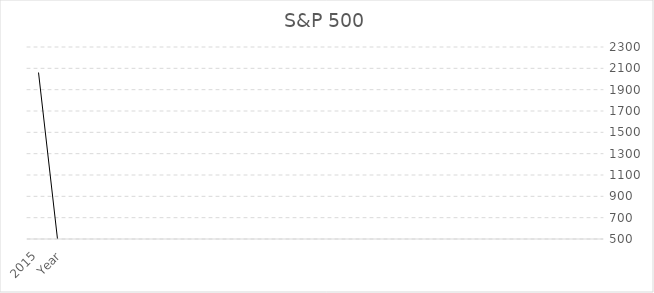
| Category | Series 0 | Series 1 | Series 2 |
|---|---|---|---|
| 0 | 2106.2 | 2080.76 | 2104.05 |
| 1 | 2094.32 | 1893.7 | 2079.36 |
| 2 | 2020.86 | 1871.91 | 1920.03 |
| 3 | 2112.66 | 1867.01 | 1972.18 |
| 4 | 2132.82 | 2044.02 | 2103.84 |
| 5 | 2129.87 | 2056.32 | 2063.11 |
| 6 | 2134.72 | 2067.93 | 2107.39 |
| 7 | 2125.92 | 2048.38 | 2085.51 |
| 8 | 2117.52 | 2039.69 | 2067.89 |
| 9 | 2119.59 | 1980.9 | 2104.5 |
| 10 | 2072.36 | 1988.12 | 1994.99 |
| 11 | 2093.55 | 1972.56 | 2058.9 |
| 12 | 2075.76 | 2001.01 | 2067.56 |
| 13 | 2018.19 | 1820.66 | 2018.05 |
| 14 | 2019.26 | 1964.04 | 1972.29 |
| 15 | 2005.04 | 1904.78 | 2003.37 |
| 16 | 1991.39 | 1930.67 | 1930.67 |
| 17 | 1968.17 | 1915.98 | 1960.23 |
| 18 | 1924.03 | 1859.79 | 1923.57 |
| 19 | 1897.28 | 1814.36 | 1883.95 |
| 20 | 1883.97 | 1834.44 | 1872.34 |
| 21 | 1867.92 | 1737.92 | 1859.45 |
| 22 | 1850.84 | 1770.45 | 1782.59 |
| 23 | 1849.44 | 1767.99 | 1848.36 |
| 24 | 1813.55 | 1746.2 | 1805.81 |
| 25 | 1775.22 | 1646.47 | 1756.54 |
| 26 | 1729.86 | 1633.41 | 1681.55 |
| 27 | 1709.67 | 1627.47 | 1632.97 |
| 28 | 1698.78 | 1604.57 | 1685.73 |
| 29 | 1654.19 | 1560.33 | 1606.28 |
| 30 | 1687.18 | 1581.28 | 1630.74 |
| 31 | 1597.57 | 1536.03 | 1597.57 |
| 32 | 1570.28 | 1501.48 | 1569.19 |
| 33 | 1530.94 | 1485.01 | 1514.68 |
| 34 | 1509.94 | 1426.19 | 1498.11 |
| 35 | 1448 | 1398.11 | 1426.19 |
| 36 | 1434.27 | 1343.35 | 1416.18 |
| 37 | 1470.96 | 1403.28 | 1412.16 |
| 38 | 1474.51 | 1396.56 | 1440.67 |
| 39 | 1426.68 | 1354.65 | 1406.58 |
| 40 | 1391.74 | 1325.41 | 1379.32 |
| 41 | 1363.46 | 1266.74 | 1362.16 |
| 42 | 1415.32 | 1291.98 | 1310.33 |
| 43 | 1422.38 | 1357.38 | 1397.91 |
| 44 | 1419.15 | 1340.03 | 1408.47 |
| 45 | 1378.04 | 1312.45 | 1365.68 |
| 46 | 1333.47 | 1258.86 | 1312.41 |
| 47 | 1269.37 | 1202.37 | 1257.6 |
| 48 | 1277.55 | 1158.66 | 1246.96 |
| 49 | 1292.66 | 1074.77 | 1253.3 |
| 50 | 1229.29 | 1114.22 | 1131.42 |
| 51 | 1307.38 | 1101.54 | 1218.89 |
| 52 | 1356.48 | 1282.86 | 1292.28 |
| 53 | 1345.2 | 1258.07 | 1320.64 |
| 54 | 1370.58 | 1311.8 | 1345.2 |
| 55 | 1364.56 | 1294.7 | 1363.61 |
| 56 | 1332.28 | 1249.05 | 1325.83 |
| 57 | 1344.07 | 1289.14 | 1327.22 |
| 58 | 1302.67 | 1257.62 | 1286.12 |
| 59 | 1262.6 | 1186.6 | 1257.64 |
| 60 | 1227.08 | 1173 | 1180.55 |
| 61 | 1196.14 | 1131.87 | 1183.26 |
| 62 | 1157.16 | 1049.72 | 1141.2 |
| 63 | 1129.24 | 1039.7 | 1049.33 |
| 64 | 1120.95 | 1010.91 | 1101.6 |
| 65 | 1131.23 | 1028.33 | 1030.71 |
| 66 | 1205.13 | 1040.78 | 1089.41 |
| 67 | 1219.8 | 1170.69 | 1186.69 |
| 68 | 1180.69 | 1105.36 | 1169.43 |
| 69 | 1112.42 | 1044.5 | 1104.49 |
| 70 | 1150.45 | 1071.59 | 1073.87 |
| 71 | 1130.38 | 1085.89 | 1115.1 |
| 72 | 1113.69 | 1029.38 | 1095.63 |
| 73 | 1101.36 | 1019.95 | 1036.19 |
| 74 | 1080.15 | 991.97 | 1057.08 |
| 75 | 1039.47 | 978.51 | 1020.62 |
| 76 | 996.68 | 869.32 | 987.48 |
| 77 | 956.23 | 888.86 | 919.32 |
| 78 | 930.17 | 866.1 | 919.14 |
| 79 | 888.7 | 783.32 | 872.81 |
| 80 | 832.98 | 666.79 | 797.87 |
| 81 | 875.01 | 734.52 | 735.09 |
| 82 | 943.85 | 804.3 | 825.88 |
| 83 | 918.85 | 815.69 | 903.25 |
| 84 | 1007.51 | 741.02 | 896.24 |
| 85 | 1167.03 | 839.8 | 968.75 |
| 86 | 1303.04 | 1106.42 | 1166.36 |
| 87 | 1313.15 | 1247.45 | 1282.83 |
| 88 | 1292.17 | 1200.44 | 1267.38 |
| 89 | 1404.05 | 1272 | 1280 |
| 90 | 1440.24 | 1373.07 | 1400.38 |
| 91 | 1404.57 | 1324.35 | 1385.59 |
| 92 | 1359.68 | 1256.98 | 1322.7 |
| 93 | 1396.02 | 1316.75 | 1330.63 |
| 94 | 1471.77 | 1270.05 | 1378.55 |
| 95 | 1523.57 | 1435.65 | 1468.36 |
| 96 | 1545.79 | 1406.1 | 1481.14 |
| 97 | 1576.09 | 1489.56 | 1549.38 |
| 98 | 1538.74 | 1439.29 | 1526.75 |
| 99 | 1503.89 | 1370.6 | 1473.99 |
| 100 | 1555.9 | 1454.25 | 1455.27 |
| 101 | 1540.56 | 1484.18 | 1503.35 |
| 102 | 1535.56 | 1476.7 | 1530.62 |
| 103 | 1498.02 | 1416.37 | 1482.37 |
| 104 | 1438.89 | 1363.98 | 1420.86 |
| 105 | 1461.57 | 1389.42 | 1406.82 |
| 106 | 1441.61 | 1403.97 | 1438.24 |
| 107 | 1431.81 | 1385.93 | 1418.3 |
| 108 | 1407.89 | 1360.98 | 1400.63 |
| 109 | 1389.45 | 1327.1 | 1377.94 |
| 110 | 1340.28 | 1290.93 | 1335.85 |
| 111 | 1306.74 | 1261.3 | 1303.82 |
| 112 | 1280.42 | 1224.54 | 1276.66 |
| 113 | 1290.68 | 1219.29 | 1270.2 |
| 114 | 1326.7 | 1245.34 | 1270.09 |
| 115 | 1318.16 | 1280.74 | 1310.61 |
| 116 | 1310.88 | 1268.42 | 1294.87 |
| 117 | 1297.57 | 1253.61 | 1280.66 |
| 118 | 1294.9 | 1245.74 | 1280.08 |
| 119 | 1275.8 | 1246.59 | 1248.29 |
| 120 | 1270.64 | 1201.07 | 1249.48 |
| 121 | 1233.34 | 1168.2 | 1207.01 |
| 122 | 1243.13 | 1205.35 | 1228.81 |
| 123 | 1245.86 | 1201.07 | 1220.33 |
| 124 | 1245.15 | 1183.55 | 1234.18 |
| 125 | 1219.59 | 1188.3 | 1191.33 |
| 126 | 1199.56 | 1146.18 | 1191.5 |
| 127 | 1191.88 | 1136.15 | 1156.85 |
| 128 | 1229.11 | 1163.69 | 1180.59 |
| 129 | 1212.44 | 1180.95 | 1203.6 |
| 130 | 1217.8 | 1163.75 | 1181.27 |
| 131 | 1217.33 | 1173.78 | 1211.92 |
| 132 | 1188.46 | 1127.6 | 1173.82 |
| 133 | 1142.05 | 1090.29 | 1130.2 |
| 134 | 1131.54 | 1099.18 | 1114.58 |
| 135 | 1109.68 | 1060.72 | 1104.24 |
| 136 | 1140.84 | 1078.78 | 1101.72 |
| 137 | 1146.34 | 1113.32 | 1140.84 |
| 138 | 1127.74 | 1076.32 | 1120.68 |
| 139 | 1150.57 | 1107.23 | 1107.3 |
| 140 | 1163.23 | 1087.16 | 1126.21 |
| 141 | 1158.98 | 1124.44 | 1144.94 |
| 142 | 1155.38 | 1105.08 | 1131.13 |
| 143 | 1112.56 | 1053.41 | 1111.92 |
| 144 | 1063.65 | 1031.2 | 1058.2 |
| 145 | 1053.79 | 995.97 | 1050.71 |
| 146 | 1040.29 | 990.36 | 995.97 |
| 147 | 1011.01 | 960.84 | 1008.01 |
| 148 | 1015.41 | 962.1 | 990.31 |
| 149 | 1015.33 | 963.59 | 974.5 |
| 150 | 965.38 | 902.83 | 963.59 |
| 151 | 924.24 | 847.85 | 916.92 |
| 152 | 895.9 | 788.9 | 848.18 |
| 153 | 864.64 | 806.29 | 841.15 |
| 154 | 935.05 | 840.34 | 855.7 |
| 155 | 954.28 | 869.45 | 879.82 |
| 156 | 941.82 | 872.05 | 936.31 |
| 157 | 907.44 | 768.63 | 885.76 |
| 158 | 924.02 | 800.2 | 815.28 |
| 159 | 965 | 833.44 | 916.07 |
| 160 | 994.46 | 775.68 | 911.62 |
| 161 | 1070.74 | 952.92 | 989.82 |
| 162 | 1106.59 | 1048.96 | 1067.14 |
| 163 | 1147.84 | 1063.46 | 1076.92 |
| 164 | 1173.94 | 1106.73 | 1147.39 |
| 165 | 1130.2 | 1074.36 | 1106.73 |
| 166 | 1176.97 | 1081.66 | 1130.2 |
| 167 | 1173.62 | 1114.53 | 1148.08 |
| 168 | 1163.38 | 1054.31 | 1139.45 |
| 169 | 1110.61 | 1026.76 | 1059.78 |
| 170 | 1155.4 | 944.75 | 1040.94 |
| 171 | 1226.27 | 1124.87 | 1133.58 |
| 172 | 1239.78 | 1165.54 | 1211.23 |
| 173 | 1286.62 | 1203.03 | 1224.38 |
| 174 | 1315.93 | 1232 | 1255.82 |
| 175 | 1269.3 | 1091.99 | 1249.46 |
| 176 | 1267.42 | 1081.19 | 1160.33 |
| 177 | 1376.38 | 1215.44 | 1239.94 |
| 178 | 1383.37 | 1274.62 | 1366.01 |
| 179 | 1389.05 | 1254.07 | 1320.28 |
| 180 | 1438.46 | 1294.9 | 1314.95 |
| 181 | 1454.82 | 1305.79 | 1429.4 |
| 182 | 1530.09 | 1419.44 | 1436.51 |
| 183 | 1525.21 | 1425.43 | 1517.68 |
| 184 | 1517.32 | 1413.89 | 1430.83 |
| 185 | 1488.93 | 1420.6 | 1454.6 |
| 186 | 1481.51 | 1361.09 | 1420.6 |
| 187 | 1527.19 | 1339.4 | 1452.43 |
| 188 | 1552.87 | 1346.62 | 1498.58 |
| 189 | 1444.55 | 1325.07 | 1366.42 |
| 190 | 1478 | 1350.14 | 1394.46 |
| 191 | 1473.1 | 1387.38 | 1469.25 |
| 192 | 1425.31 | 1346.41 | 1388.91 |
| 193 | 1373.17 | 1233.7 | 1362.93 |
| 194 | 1361.39 | 1256.26 | 1282.71 |
| 195 | 1382.84 | 1267.73 | 1320.41 |
| 196 | 1420.33 | 1328.49 | 1328.72 |
| 197 | 1372.93 | 1277.47 | 1372.71 |
| 198 | 1375.98 | 1277.31 | 1301.84 |
| 199 | 1371.56 | 1282.56 | 1335.18 |
| 200 | 1323.82 | 1216.03 | 1286.37 |
| 201 | 1283.84 | 1211.89 | 1238.33 |
| 202 | 1280.37 | 1205.46 | 1279.64 |
| 203 | 1244.93 | 1136.89 | 1229.23 |
| 204 | 1192.97 | 1098.67 | 1163.63 |
| 205 | 1103.78 | 923.32 | 1098.67 |
| 206 | 1066.11 | 939.98 | 1017.01 |
| 207 | 1121.79 | 957.28 | 957.28 |
| 208 | 1190.58 | 1114.3 | 1120.67 |
| 209 | 1145.15 | 1074.67 | 1133.84 |
| 210 | 1130.52 | 1074.39 | 1090.82 |
| 211 | 1132.98 | 1076.7 | 1111.75 |
| 212 | 1113.07 | 1030.87 | 1101.75 |
| 213 | 1051.66 | 980.28 | 1049.34 |
| 214 | 992.65 | 912.83 | 980.28 |
| 215 | 986.25 | 924.92 | 970.43 |
| 216 | 964.55 | 900.61 | 955.4 |
| 217 | 983.12 | 855.27 | 914.62 |
| 218 | 960.59 | 899.47 | 947.28 |
| 219 | 964.17 | 893.34 | 899.47 |
| 220 | 957.73 | 884.54 | 954.31 |
| 221 | 902.09 | 838.82 | 885.14 |
| 222 | 851.87 | 793.21 | 848.28 |
| 223 | 804.13 | 733.54 | 801.34 |
| 224 | 814.9 | 756.13 | 757.12 |
| 225 | 817.68 | 773.43 | 790.82 |
| 226 | 794.67 | 729.55 | 786.16 |
| 227 | 761.75 | 716.69 | 740.74 |
| 228 | 762.12 | 701.3 | 757.02 |
| 229 | 714.1 | 684.44 | 705.27 |
| 230 | 690.88 | 643.97 | 687.33 |
| 231 | 670.68 | 639.49 | 651.99 |
| 232 | 675.88 | 605.88 | 639.95 |
| 233 | 680.32 | 658.75 | 670.63 |
| 234 | 681.1 | 630.07 | 669.12 |
| 235 | 656.68 | 624.14 | 654.17 |
| 236 | 656.97 | 627.63 | 645.5 |
| 237 | 664.23 | 633.71 | 640.43 |
| 238 | 636.18 | 597.29 | 636.02 |
| 239 | 622.88 | 605.05 | 615.93 |
| 240 | 608.69 | 581.04 | 605.37 |
| 241 | 590.66 | 571.55 | 581.5 |
| 242 | 587.61 | 561.01 | 584.41 |
| 243 | 565.62 | 553.04 | 561.88 |
| 244 | 565.4 | 542.51 | 562.06 |
| 245 | 551.07 | 526 | 544.75 |
| 246 | 533.41 | 513.03 | 533.4 |
| 247 | 515.29 | 500.2 | 514.71 |
| 248 | 508.15 | 479.7 | 500.71 |
| 249 | 489.19 | 469.29 | 487.39 |
| 250 | 471.36 | 457.2 | 470.42 |